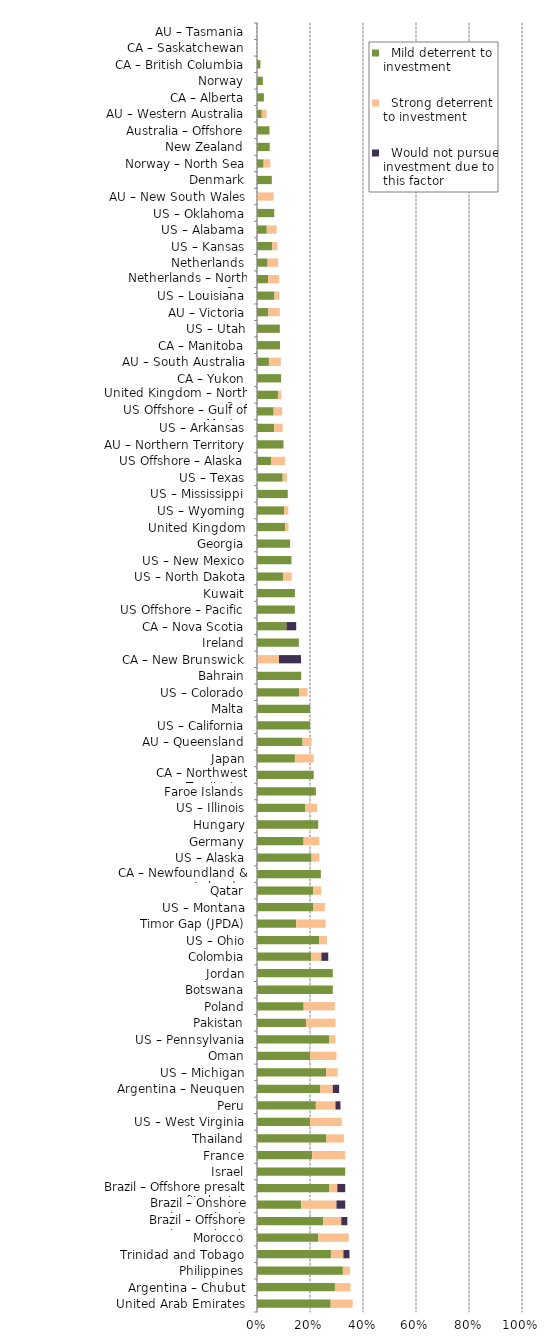
| Category |   Mild deterrent to investment |   Strong deterrent to investment |   Would not pursue investment due to this factor |
|---|---|---|---|
| United Arab Emirates | 0.278 | 0.083 | 0 |
| Argentina – Chubut | 0.294 | 0.059 | 0 |
| Philippines | 0.324 | 0.027 | 0 |
| Trinidad and Tobago | 0.279 | 0.047 | 0.023 |
| Morocco | 0.231 | 0.115 | 0 |
| Brazil – Offshore concession contracts | 0.25 | 0.068 | 0.023 |
| Brazil – Onshore concession contracts | 0.167 | 0.133 | 0.033 |
| Brazil – Offshore presalt area profit sharing contracts | 0.273 | 0.03 | 0.03 |
| Israel | 0.333 | 0 | 0 |
| France | 0.208 | 0.125 | 0 |
| Thailand | 0.262 | 0.066 | 0 |
| US – West Virginia | 0.2 | 0.12 | 0 |
| Peru | 0.222 | 0.074 | 0.019 |
| Argentina – Neuquen | 0.238 | 0.048 | 0.024 |
| US – Michigan | 0.261 | 0.043 | 0 |
| Oman | 0.2 | 0.1 | 0 |
| US – Pennsylvania | 0.273 | 0.023 | 0 |
| Pakistan | 0.185 | 0.111 | 0 |
| Poland | 0.176 | 0.118 | 0 |
| Botswana | 0.286 | 0 | 0 |
| Jordan | 0.286 | 0 | 0 |
| Colombia | 0.205 | 0.038 | 0.026 |
| US – Ohio | 0.235 | 0.029 | 0 |
| Timor Gap (JPDA) | 0.148 | 0.111 | 0 |
| US – Montana | 0.213 | 0.043 | 0 |
| Qatar | 0.212 | 0.03 | 0 |
| CA – Newfoundland & Labrador | 0.241 | 0 | 0 |
| US – Alaska | 0.206 | 0.029 | 0 |
| Germany | 0.176 | 0.059 | 0 |
| Hungary | 0.231 | 0 | 0 |
| US – Illinois | 0.182 | 0.045 | 0 |
| Faroe Islands | 0.222 | 0 | 0 |
| CA – Northwest Territories | 0.214 | 0 | 0 |
| Japan | 0.143 | 0.071 | 0 |
| AU – Queensland | 0.172 | 0.034 | 0 |
| US – California | 0.2 | 0 | 0 |
| Malta | 0.2 | 0 | 0 |
| US – Colorado | 0.159 | 0.032 | 0 |
| Bahrain | 0.167 | 0 | 0 |
| CA – New Brunswick | 0 | 0.083 | 0.083 |
| Ireland | 0.158 | 0 | 0 |
| CA – Nova Scotia | 0.111 | 0 | 0.037 |
| US Offshore – Pacific | 0.143 | 0 | 0 |
| Kuwait | 0.143 | 0 | 0 |
| US – North Dakota | 0.098 | 0.033 | 0 |
| US – New Mexico | 0.13 | 0 | 0 |
| Georgia | 0.125 | 0 | 0 |
| United Kingdom | 0.107 | 0.012 | 0 |
| US – Wyoming | 0.103 | 0.015 | 0 |
| US – Mississippi | 0.116 | 0 | 0 |
| US – Texas | 0.097 | 0.016 | 0 |
| US Offshore – Alaska | 0.053 | 0.053 | 0 |
| AU – Northern Territory | 0.1 | 0 | 0 |
| US – Arkansas | 0.065 | 0.032 | 0 |
| US Offshore – Gulf of Mexico | 0.063 | 0.032 | 0 |
| United Kingdom – North Sea | 0.079 | 0.013 | 0 |
| CA – Yukon | 0.091 | 0 | 0 |
| AU – South Australia | 0.045 | 0.045 | 0 |
| CA – Manitoba | 0.087 | 0 | 0 |
| US – Utah | 0.086 | 0 | 0 |
| AU – Victoria | 0.043 | 0.043 | 0 |
| US – Louisiana | 0.066 | 0.019 | 0 |
| Netherlands – North Sea | 0.042 | 0.042 | 0 |
| Netherlands | 0.04 | 0.04 | 0 |
| US – Kansas | 0.058 | 0.019 | 0 |
| US – Alabama | 0.037 | 0.037 | 0 |
| US – Oklahoma | 0.065 | 0 | 0 |
| AU – New South Wales | 0 | 0.063 | 0 |
| Denmark | 0.056 | 0 | 0 |
| Norway – North Sea | 0.025 | 0.025 | 0 |
| New Zealand | 0.048 | 0 | 0 |
| Australia – Offshore | 0.047 | 0 | 0 |
| AU – Western Australia | 0.018 | 0.018 | 0 |
| CA – Alberta | 0.026 | 0 | 0 |
| Norway | 0.022 | 0 | 0 |
| CA – British Columbia | 0.013 | 0 | 0 |
| CA – Saskatchewan | 0 | 0 | 0 |
| AU – Tasmania | 0 | 0 | 0 |